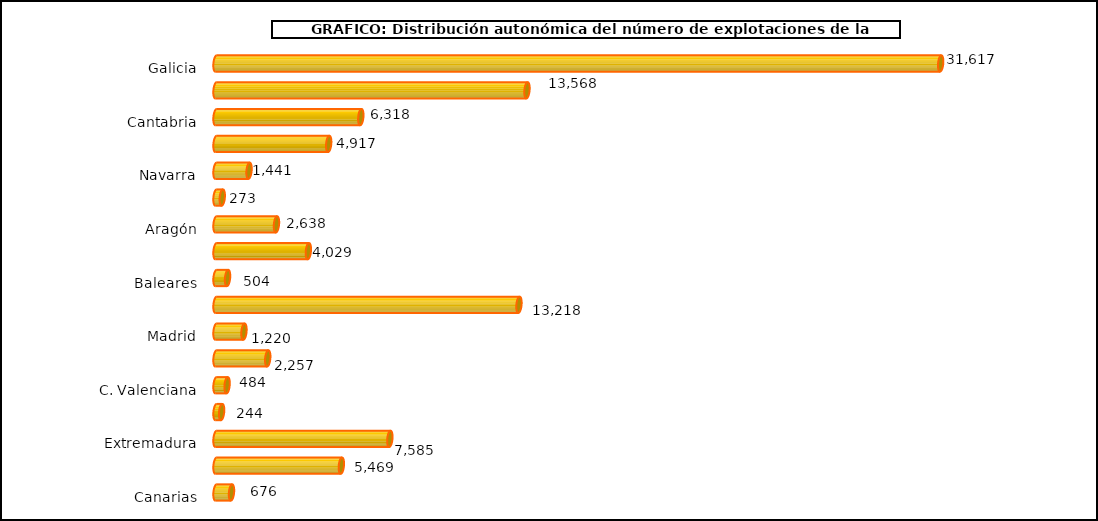
| Category | num. Explotaciones |
|---|---|
| 0 | 31617 |
| 1 | 13568 |
| 2 | 6318 |
| 3 | 4917 |
| 4 | 1441 |
| 5 | 273 |
| 6 | 2638 |
| 7 | 4029 |
| 8 | 504 |
| 9 | 13218 |
| 10 | 1220 |
| 11 | 2257 |
| 12 | 484 |
| 13 | 244 |
| 14 | 7585 |
| 15 | 5469 |
| 16 | 676 |